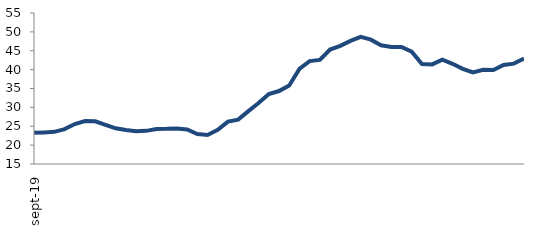
| Category | Series 0 |
|---|---|
| 2019-09-01 | 23.263 |
| 2019-10-01 | 23.369 |
| 2019-11-01 | 23.525 |
| 2019-12-01 | 24.256 |
| 2020-01-01 | 25.597 |
| 2020-02-01 | 26.375 |
| 2020-03-01 | 26.322 |
| 2020-04-01 | 25.369 |
| 2020-05-01 | 24.446 |
| 2020-06-01 | 24.028 |
| 2020-07-01 | 23.685 |
| 2020-08-01 | 23.782 |
| 2020-09-01 | 24.28 |
| 2020-10-01 | 24.323 |
| 2020-11-01 | 24.433 |
| 2020-12-01 | 24.131 |
| 2021-01-01 | 22.928 |
| 2021-02-01 | 22.701 |
| 2021-03-01 | 24.039 |
| 2021-04-01 | 26.229 |
| 2021-05-01 | 26.758 |
| 2021-06-01 | 29.013 |
| 2021-07-01 | 31.153 |
| 2021-08-01 | 33.54 |
| 2021-09-01 | 34.33 |
| 2021-10-01 | 35.804 |
| 2021-11-01 | 40.209 |
| 2021-12-01 | 42.248 |
| 2022-01-01 | 42.562 |
| 2022-02-01 | 45.314 |
| 2022-03-01 | 46.285 |
| 2022-04-01 | 47.614 |
| 2022-05-01 | 48.674 |
| 2022-06-01 | 47.931 |
| 2022-07-01 | 46.442 |
| 2022-08-01 | 46 |
| 2022-09-01 | 45.983 |
| 2022-10-01 | 44.739 |
| 2022-11-01 | 41.492 |
| 2022-12-01 | 41.391 |
| 2023-01-01 | 42.634 |
| 2023-02-01 | 41.54 |
| 2023-03-01 | 40.198 |
| 2023-04-01 | 39.238 |
| 2023-05-01 | 39.944 |
| 2023-06-01 | 39.891 |
| 2023-07-01 | 41.221 |
| 2023-08-01 | 41.581 |
| 2023-09-01 | 42.921 |